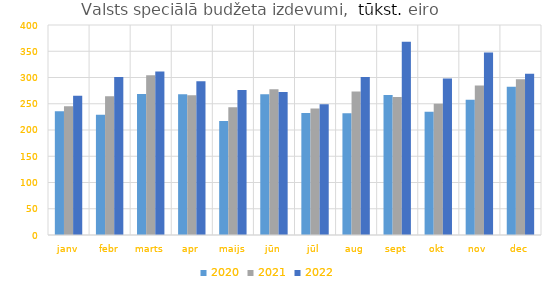
| Category | 2020 | 2021 | 2022 |
|---|---|---|---|
| janv | 235781.445 | 245021.603 | 265366.62 |
| febr | 229202.237 | 264114.802 | 301122.134 |
| marts | 268426.032 | 304192.595 | 311449.105 |
| apr | 267906.805 | 266305.843 | 292908.695 |
| maijs | 217225.441 | 243231.118 | 276006.043 |
| jūn | 268178.04 | 277705.46 | 272418.808 |
| jūl | 232397.631 | 241038.074 | 248833.143 |
| aug | 232000.053 | 273534.561 | 300867.01 |
| sept | 266855.812 | 262890.697 | 368202.062 |
| okt | 234655.305 | 249947.821 | 298051.418 |
| nov | 257570.365 | 284917.624 | 347493.693 |
| dec | 282446.284 | 296686.983 | 306911.749 |